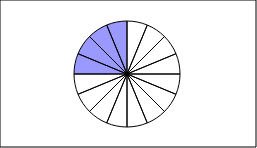
| Category | Series 0 | Series 1 |
|---|---|---|
| 0 | 1 |  |
| 1 | 1 |  |
| 2 | 1 |  |
| 3 | 1 |  |
| 4 | 1 |  |
| 5 | 1 |  |
| 6 | 1 |  |
| 7 | 1 |  |
| 8 | 1 |  |
| 9 | 1 |  |
| 10 | 1 |  |
| 11 | 1 |  |
| 12 | 1 |  |
| 13 | 1 |  |
| 14 | 1 |  |
| 15 | 1 |  |